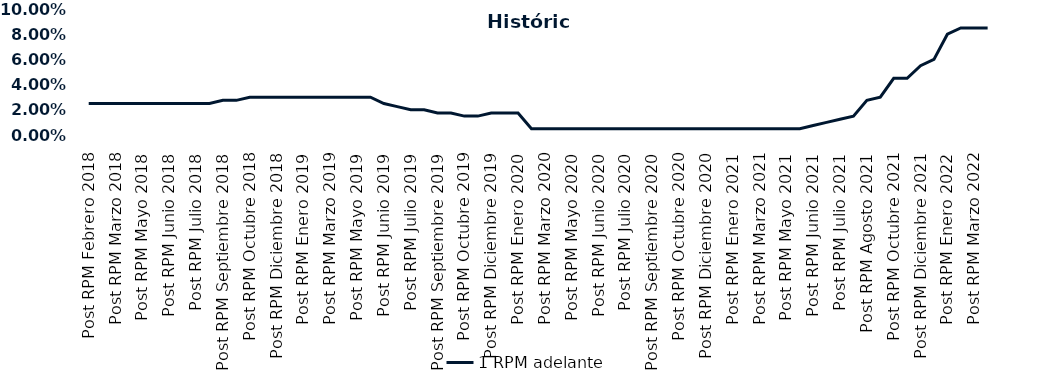
| Category | 1 RPM adelante |
|---|---|
| Post RPM Febrero 2018 | 0.025 |
| Pre RPM Marzo 2018 | 0.025 |
| Post RPM Marzo 2018 | 0.025 |
| Pre RPM Mayo 2018 | 0.025 |
| Post RPM Mayo 2018 | 0.025 |
| Pre RPM Junio 2018 | 0.025 |
| Post RPM Junio 2018 | 0.025 |
| Pre RPM Julio 2018 | 0.025 |
| Post RPM Julio 2018 | 0.025 |
| Pre RPM Septiembre 2018 | 0.025 |
| Post RPM Septiembre 2018 | 0.028 |
| Pre RPM Octubre 2018 | 0.028 |
| Post RPM Octubre 2018 | 0.03 |
| Pre RPM Diciembre 2018 | 0.03 |
| Post RPM Diciembre 2018 | 0.03 |
| Pre RPM Enero 2019 | 0.03 |
| Post RPM Enero 2019 | 0.03 |
| Pre RPM Marzo 2019 | 0.03 |
| Post RPM Marzo 2019 | 0.03 |
| Pre RPM Mayo 2019 | 0.03 |
| Post RPM Mayo 2019 | 0.03 |
| Pre RPM Junio 2019 | 0.03 |
| Post RPM Junio 2019 | 0.025 |
| Pre RPM Julio 2019 | 0.022 |
| Post RPM Julio 2019 | 0.02 |
| Pre RPM Septiembre 2019 | 0.02 |
| Post RPM Septiembre 2019 | 0.018 |
| Pre RPM Octubre 2019 | 0.018 |
| Post RPM Octubre 2019 | 0.015 |
| Pre RPM Diciembre 2019 | 0.015 |
| Post RPM Diciembre 2019 | 0.018 |
| Pre RPM Enero 2020 | 0.018 |
| Post RPM Enero 2020 | 0.018 |
| Pre RPM Marzo 2020 | 0.005 |
| Post RPM Marzo 2020 | 0.005 |
| Pre RPM Mayo 2020 | 0.005 |
| Post RPM Mayo 2020 | 0.005 |
| Pre RPM Junio 2020 | 0.005 |
| Post RPM Junio 2020 | 0.005 |
| Pre RPM Julio 2020 | 0.005 |
| Post RPM Julio 2020 | 0.005 |
| Pre RPM Septiembre 2020 | 0.005 |
| Post RPM Septiembre 2020 | 0.005 |
| Pre RPM Octubre 2020 | 0.005 |
| Post RPM Octubre 2020 | 0.005 |
| Pre RPM Diciembre 2020 | 0.005 |
| Post RPM Diciembre 2020 | 0.005 |
| Pre RPM Enero 2021 | 0.005 |
| Post RPM Enero 2021 | 0.005 |
| Pre RPM Marzo 2021 | 0.005 |
| Post RPM Marzo 2021 | 0.005 |
| Pre RPM Mayo 2021 | 0.005 |
| Post RPM Mayo 2021 | 0.005 |
| Pre RPM Junio 2021 | 0.005 |
| Post RPM Junio 2021 | 0.008 |
| Pre RPM Julio 2021 | 0.01 |
| Post RPM Julio 2021 | 0.012 |
| Pre RPM Agosto 2021 | 0.015 |
| Post RPM Agosto 2021 | 0.028 |
| Pre RPM Octubre 2021 | 0.03 |
| Post RPM Octubre 2021 | 0.045 |
| Pre RPM Diciembre 2021 | 0.045 |
| Post RPM Diciembre 2021 | 0.055 |
| Pre RPM Enero 2022 | 0.06 |
| Post RPM Enero 2022 | 0.08 |
| Pre RPM Marzo 2022 | 0.085 |
| Post RPM Marzo 2022 | 0.085 |
| Pre RPM Mayo 2022 | 0.085 |